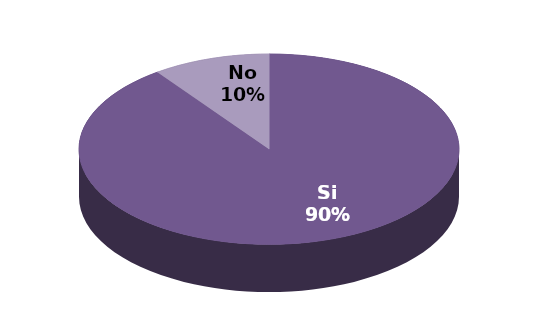
| Category | Series 1 |
|---|---|
| Si | 27 |
| No | 3 |